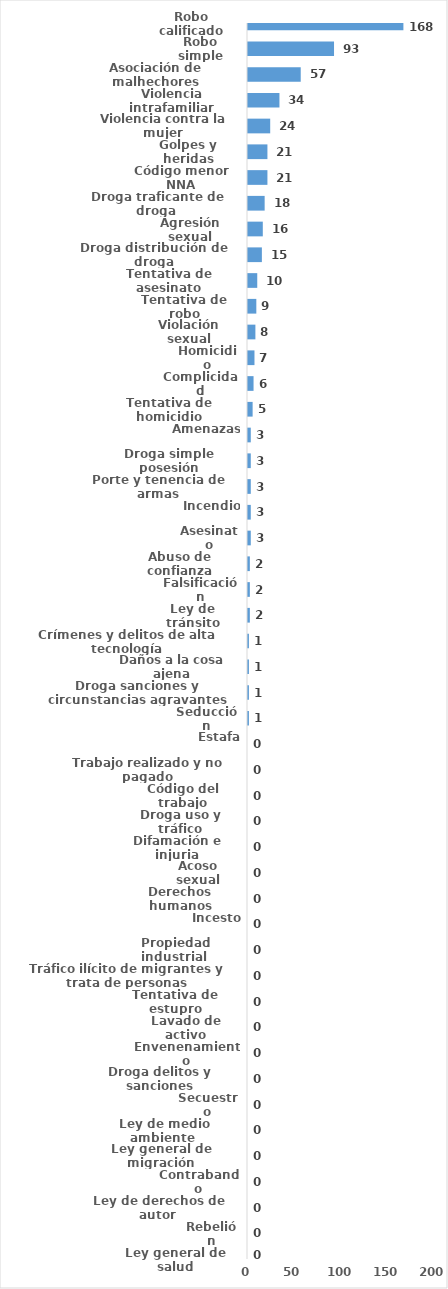
| Category | Series 0 |
|---|---|
| Robo calificado | 168 |
| Robo simple | 93 |
| Asociación de malhechores | 57 |
| Violencia intrafamiliar | 34 |
| Violencia contra la mujer | 24 |
| Golpes y heridas | 21 |
| Código menor NNA | 21 |
| Droga traficante de droga  | 18 |
| Agresión sexual | 16 |
| Droga distribución de droga | 15 |
| Tentativa de asesinato | 10 |
| Tentativa de robo | 9 |
| Violación sexual | 8 |
| Homicidio | 7 |
| Complicidad | 6 |
| Tentativa de homicidio | 5 |
| Amenazas | 3 |
| Droga simple posesión | 3 |
| Porte y tenencia de armas | 3 |
| Incendio | 3 |
| Asesinato | 3 |
| Abuso de confianza | 2 |
| Falsificación | 2 |
| Ley de tránsito | 2 |
| Crímenes y delitos de alta tecnología | 1 |
| Daños a la cosa ajena | 1 |
| Droga sanciones y circunstancias agravantes | 1 |
| Seducción | 1 |
| Estafa | 0 |
| Trabajo realizado y no pagado | 0 |
| Código del trabajo | 0 |
| Droga uso y tráfico | 0 |
| Difamación e injuria | 0 |
| Acoso sexual | 0 |
| Derechos humanos | 0 |
| Incesto | 0 |
| Propiedad industrial  | 0 |
| Tráfico ilícito de migrantes y trata de personas | 0 |
| Tentativa de estupro | 0 |
| Lavado de activo | 0 |
| Envenenamiento | 0 |
| Droga delitos y sanciones | 0 |
| Secuestro | 0 |
| Ley de medio ambiente  | 0 |
| Ley general de migración | 0 |
| Contrabando | 0 |
| Ley de derechos de autor  | 0 |
| Rebelión | 0 |
| Ley general de salud | 0 |